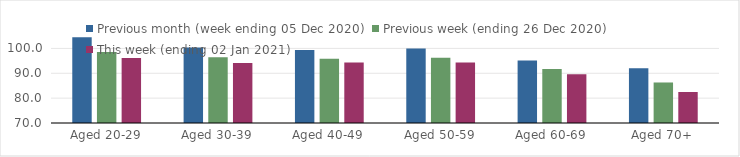
| Category | Previous month (week ending 05 Dec 2020) | Previous week (ending 26 Dec 2020) | This week (ending 02 Jan 2021) |
|---|---|---|---|
| Aged 20-29 | 104.48 | 98.61 | 96.15 |
| Aged 30-39 | 100.42 | 96.5 | 94.13 |
| Aged 40-49 | 99.4 | 95.89 | 94.34 |
| Aged 50-59 | 99.96 | 96.25 | 94.38 |
| Aged 60-69 | 95.12 | 91.71 | 89.63 |
| Aged 70+ | 92.05 | 86.3 | 82.47 |